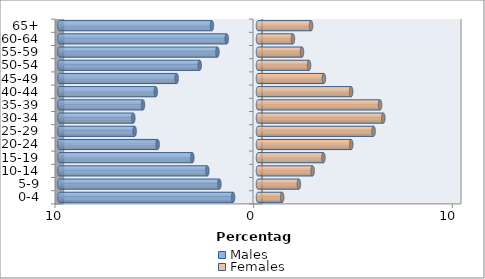
| Category | Males | Females |
|---|---|---|
| 0-4 | -1.254 | 1.215 |
| 5-9 | -1.945 | 2.059 |
| 10-14 | -2.552 | 2.749 |
| 15-19 | -3.305 | 3.293 |
| 20-24 | -5.053 | 4.693 |
| 25-29 | -6.209 | 5.818 |
| 30-34 | -6.278 | 6.308 |
| 35-39 | -5.79 | 6.144 |
| 40-44 | -5.145 | 4.689 |
| 45-49 | -4.096 | 3.317 |
| 50-54 | -2.936 | 2.57 |
| 55-59 | -2.043 | 2.214 |
| 60-64 | -1.575 | 1.758 |
| 65+ | -2.32 | 2.672 |